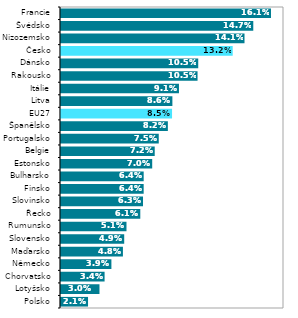
| Category | Series 1 |
|---|---|
| Polsko | 0.021 |
| Lotyšsko | 0.03 |
| Chorvatsko | 0.034 |
| Německo | 0.039 |
| Maďarsko | 0.048 |
| Slovensko | 0.049 |
| Rumunsko | 0.051 |
| Řecko | 0.061 |
| Slovinsko | 0.063 |
| Finsko | 0.064 |
| Bulharsko | 0.064 |
| Estonsko | 0.07 |
| Belgie | 0.072 |
| Portugalsko | 0.075 |
| Španělsko | 0.082 |
| EU27 | 0.085 |
| Litva | 0.086 |
| Itálie | 0.091 |
| Rakousko | 0.105 |
| Dánsko | 0.105 |
| Česko | 0.132 |
| Nizozemsko | 0.141 |
| Švédsko | 0.147 |
| Francie | 0.161 |